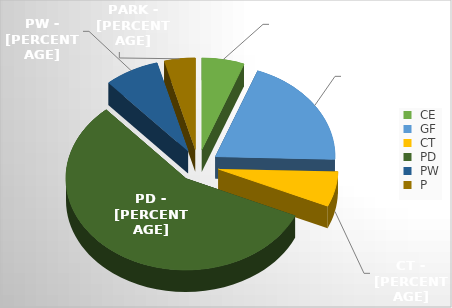
| Category | Series 0 |
|---|---|
|  CE  | 109931 |
|  GF  | 377214 |
|  CT  | 118125 |
|  PD  | 1086462 |
|  PW  | 141162 |
|  P  | 80015 |